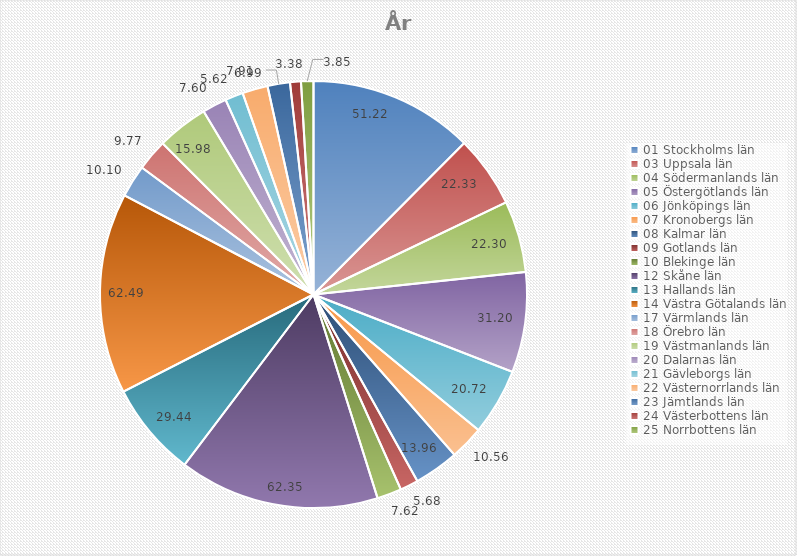
| Category | Series 0 |
|---|---|
| 01 Stockholms län | 51.22 |
| 03 Uppsala län | 22.33 |
| 04 Södermanlands län | 22.3 |
| 05 Östergötlands län | 31.2 |
| 06 Jönköpings län | 20.72 |
| 07 Kronobergs län | 10.56 |
| 08 Kalmar län | 13.96 |
| 09 Gotlands län | 5.68 |
| 10 Blekinge län | 7.62 |
| 12 Skåne län | 62.35 |
| 13 Hallands län | 29.44 |
| 14 Västra Götalands län | 62.49 |
| 17 Värmlands län | 10.1 |
| 18 Örebro län | 9.77 |
| 19 Västmanlands län | 15.98 |
| 20 Dalarnas län | 7.6 |
| 21 Gävleborgs län | 5.62 |
| 22 Västernorrlands län | 7.91 |
| 23 Jämtlands län | 6.99 |
| 24 Västerbottens län | 3.38 |
| 25 Norrbottens län | 3.85 |